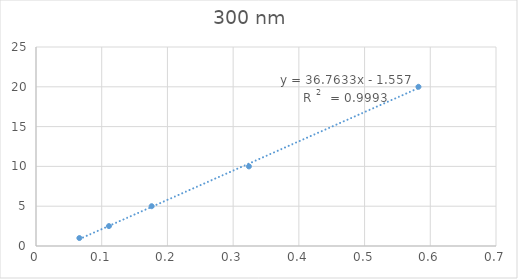
| Category | Series 0 |
|---|---|
| 0.066 | 1 |
| 0.176 | 5 |
| 0.324 | 10 |
| 0.582 | 20 |
| 0.111 | 2.5 |